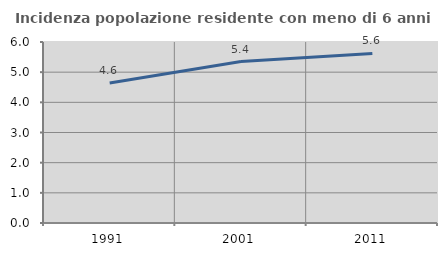
| Category | Incidenza popolazione residente con meno di 6 anni |
|---|---|
| 1991.0 | 4.639 |
| 2001.0 | 5.353 |
| 2011.0 | 5.622 |